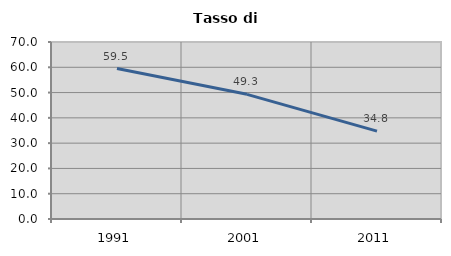
| Category | Tasso di disoccupazione   |
|---|---|
| 1991.0 | 59.519 |
| 2001.0 | 49.305 |
| 2011.0 | 34.761 |